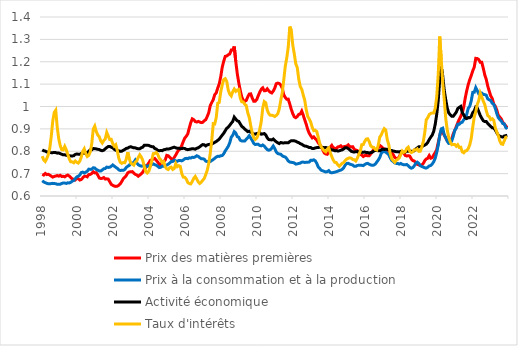
| Category | Prix des matières premières | Prix à la consommation et à la production | Activité économique | Taux d'intérêts |
|---|---|---|---|---|
| 1998-02-01 | 0.697 | 0.668 | 0.806 | 0.778 |
| 1998-03-01 | 0.694 | 0.663 | 0.802 | 0.761 |
| 1998-04-01 | 0.701 | 0.66 | 0.801 | 0.754 |
| 1998-05-01 | 0.696 | 0.657 | 0.797 | 0.767 |
| 1998-06-01 | 0.697 | 0.654 | 0.796 | 0.784 |
| 1998-07-01 | 0.693 | 0.655 | 0.794 | 0.813 |
| 1998-08-01 | 0.689 | 0.656 | 0.794 | 0.866 |
| 1998-09-01 | 0.684 | 0.657 | 0.794 | 0.935 |
| 1998-10-01 | 0.688 | 0.656 | 0.795 | 0.973 |
| 1998-11-01 | 0.689 | 0.655 | 0.794 | 0.983 |
| 1998-12-01 | 0.691 | 0.652 | 0.792 | 0.906 |
| 1999-01-01 | 0.689 | 0.653 | 0.792 | 0.856 |
| 1999-02-01 | 0.693 | 0.653 | 0.789 | 0.825 |
| 1999-03-01 | 0.687 | 0.656 | 0.787 | 0.807 |
| 1999-04-01 | 0.688 | 0.658 | 0.784 | 0.806 |
| 1999-05-01 | 0.686 | 0.658 | 0.784 | 0.822 |
| 1999-06-01 | 0.691 | 0.656 | 0.782 | 0.807 |
| 1999-07-01 | 0.694 | 0.659 | 0.781 | 0.786 |
| 1999-08-01 | 0.689 | 0.658 | 0.78 | 0.765 |
| 1999-09-01 | 0.682 | 0.661 | 0.779 | 0.753 |
| 1999-10-01 | 0.677 | 0.666 | 0.779 | 0.752 |
| 1999-11-01 | 0.675 | 0.669 | 0.78 | 0.749 |
| 1999-12-01 | 0.672 | 0.677 | 0.786 | 0.756 |
| 2000-01-01 | 0.68 | 0.685 | 0.788 | 0.751 |
| 2000-02-01 | 0.677 | 0.688 | 0.787 | 0.747 |
| 2000-03-01 | 0.671 | 0.694 | 0.786 | 0.755 |
| 2000-04-01 | 0.673 | 0.705 | 0.79 | 0.774 |
| 2000-05-01 | 0.681 | 0.707 | 0.79 | 0.8 |
| 2000-06-01 | 0.688 | 0.703 | 0.791 | 0.811 |
| 2000-07-01 | 0.689 | 0.707 | 0.791 | 0.789 |
| 2000-08-01 | 0.686 | 0.711 | 0.795 | 0.776 |
| 2000-09-01 | 0.696 | 0.72 | 0.799 | 0.782 |
| 2000-10-01 | 0.697 | 0.719 | 0.806 | 0.797 |
| 2000-11-01 | 0.701 | 0.719 | 0.807 | 0.834 |
| 2000-12-01 | 0.708 | 0.726 | 0.812 | 0.899 |
| 2001-01-01 | 0.703 | 0.726 | 0.812 | 0.913 |
| 2001-02-01 | 0.704 | 0.719 | 0.81 | 0.888 |
| 2001-03-01 | 0.694 | 0.715 | 0.809 | 0.872 |
| 2001-04-01 | 0.681 | 0.712 | 0.808 | 0.865 |
| 2001-05-01 | 0.678 | 0.712 | 0.804 | 0.846 |
| 2001-06-01 | 0.679 | 0.716 | 0.802 | 0.837 |
| 2001-07-01 | 0.682 | 0.722 | 0.805 | 0.848 |
| 2001-08-01 | 0.676 | 0.723 | 0.811 | 0.855 |
| 2001-09-01 | 0.677 | 0.729 | 0.817 | 0.884 |
| 2001-10-01 | 0.676 | 0.728 | 0.821 | 0.868 |
| 2001-11-01 | 0.664 | 0.729 | 0.821 | 0.852 |
| 2001-12-01 | 0.652 | 0.733 | 0.818 | 0.853 |
| 2002-01-01 | 0.648 | 0.739 | 0.815 | 0.834 |
| 2002-02-01 | 0.644 | 0.733 | 0.809 | 0.823 |
| 2002-03-01 | 0.643 | 0.728 | 0.805 | 0.829 |
| 2002-04-01 | 0.644 | 0.724 | 0.803 | 0.804 |
| 2002-05-01 | 0.648 | 0.717 | 0.802 | 0.769 |
| 2002-06-01 | 0.654 | 0.714 | 0.799 | 0.751 |
| 2002-07-01 | 0.665 | 0.715 | 0.8 | 0.746 |
| 2002-08-01 | 0.677 | 0.715 | 0.804 | 0.75 |
| 2002-09-01 | 0.684 | 0.719 | 0.808 | 0.749 |
| 2002-10-01 | 0.691 | 0.727 | 0.813 | 0.764 |
| 2002-11-01 | 0.703 | 0.733 | 0.814 | 0.796 |
| 2002-12-01 | 0.708 | 0.737 | 0.818 | 0.767 |
| 2003-01-01 | 0.708 | 0.747 | 0.82 | 0.746 |
| 2003-02-01 | 0.709 | 0.746 | 0.818 | 0.743 |
| 2003-03-01 | 0.703 | 0.75 | 0.815 | 0.738 |
| 2003-04-01 | 0.697 | 0.76 | 0.815 | 0.751 |
| 2003-05-01 | 0.694 | 0.748 | 0.813 | 0.757 |
| 2003-06-01 | 0.688 | 0.74 | 0.811 | 0.772 |
| 2003-07-01 | 0.694 | 0.736 | 0.811 | 0.784 |
| 2003-08-01 | 0.699 | 0.733 | 0.816 | 0.774 |
| 2003-09-01 | 0.706 | 0.734 | 0.818 | 0.76 |
| 2003-10-01 | 0.719 | 0.736 | 0.826 | 0.732 |
| 2003-11-01 | 0.727 | 0.735 | 0.827 | 0.709 |
| 2003-12-01 | 0.738 | 0.732 | 0.827 | 0.703 |
| 2004-01-01 | 0.747 | 0.735 | 0.826 | 0.71 |
| 2004-02-01 | 0.759 | 0.735 | 0.823 | 0.731 |
| 2004-03-01 | 0.761 | 0.741 | 0.821 | 0.757 |
| 2004-04-01 | 0.765 | 0.743 | 0.82 | 0.789 |
| 2004-05-01 | 0.768 | 0.74 | 0.812 | 0.79 |
| 2004-06-01 | 0.76 | 0.738 | 0.81 | 0.794 |
| 2004-07-01 | 0.752 | 0.733 | 0.804 | 0.786 |
| 2004-08-01 | 0.742 | 0.727 | 0.803 | 0.769 |
| 2004-09-01 | 0.74 | 0.728 | 0.803 | 0.762 |
| 2004-10-01 | 0.75 | 0.734 | 0.803 | 0.749 |
| 2004-11-01 | 0.755 | 0.733 | 0.807 | 0.753 |
| 2004-12-01 | 0.761 | 0.734 | 0.808 | 0.73 |
| 2005-01-01 | 0.782 | 0.739 | 0.81 | 0.722 |
| 2005-02-01 | 0.78 | 0.742 | 0.81 | 0.718 |
| 2005-03-01 | 0.773 | 0.748 | 0.811 | 0.727 |
| 2005-04-01 | 0.766 | 0.754 | 0.814 | 0.729 |
| 2005-05-01 | 0.763 | 0.755 | 0.816 | 0.719 |
| 2005-06-01 | 0.772 | 0.76 | 0.818 | 0.723 |
| 2005-07-01 | 0.783 | 0.757 | 0.815 | 0.744 |
| 2005-08-01 | 0.796 | 0.755 | 0.813 | 0.731 |
| 2005-09-01 | 0.806 | 0.759 | 0.814 | 0.735 |
| 2005-10-01 | 0.811 | 0.759 | 0.812 | 0.732 |
| 2005-11-01 | 0.825 | 0.757 | 0.812 | 0.7 |
| 2005-12-01 | 0.843 | 0.761 | 0.813 | 0.685 |
| 2006-01-01 | 0.859 | 0.767 | 0.812 | 0.683 |
| 2006-02-01 | 0.867 | 0.768 | 0.809 | 0.676 |
| 2006-03-01 | 0.877 | 0.767 | 0.807 | 0.66 |
| 2006-04-01 | 0.903 | 0.771 | 0.808 | 0.656 |
| 2006-05-01 | 0.927 | 0.77 | 0.81 | 0.654 |
| 2006-06-01 | 0.945 | 0.773 | 0.812 | 0.665 |
| 2006-07-01 | 0.941 | 0.772 | 0.811 | 0.679 |
| 2006-08-01 | 0.933 | 0.775 | 0.809 | 0.687 |
| 2006-09-01 | 0.931 | 0.78 | 0.813 | 0.676 |
| 2006-10-01 | 0.933 | 0.777 | 0.816 | 0.663 |
| 2006-11-01 | 0.931 | 0.771 | 0.82 | 0.656 |
| 2006-12-01 | 0.928 | 0.767 | 0.826 | 0.662 |
| 2007-01-01 | 0.929 | 0.767 | 0.83 | 0.67 |
| 2007-02-01 | 0.937 | 0.764 | 0.829 | 0.678 |
| 2007-03-01 | 0.941 | 0.756 | 0.824 | 0.696 |
| 2007-04-01 | 0.955 | 0.754 | 0.829 | 0.715 |
| 2007-05-01 | 0.973 | 0.754 | 0.83 | 0.747 |
| 2007-06-01 | 1.004 | 0.754 | 0.832 | 0.791 |
| 2007-07-01 | 1.018 | 0.759 | 0.832 | 0.848 |
| 2007-08-01 | 1.031 | 0.763 | 0.836 | 0.923 |
| 2007-09-01 | 1.053 | 0.769 | 0.84 | 0.922 |
| 2007-10-01 | 1.061 | 0.774 | 0.844 | 0.951 |
| 2007-11-01 | 1.083 | 0.777 | 0.849 | 1.015 |
| 2007-12-01 | 1.101 | 0.777 | 0.854 | 1.018 |
| 2008-01-01 | 1.133 | 0.78 | 0.863 | 1.065 |
| 2008-02-01 | 1.176 | 0.781 | 0.872 | 1.097 |
| 2008-03-01 | 1.203 | 0.789 | 0.88 | 1.12 |
| 2008-04-01 | 1.224 | 0.801 | 0.892 | 1.124 |
| 2008-05-01 | 1.226 | 0.812 | 0.902 | 1.112 |
| 2008-06-01 | 1.231 | 0.822 | 0.908 | 1.073 |
| 2008-07-01 | 1.235 | 0.838 | 0.916 | 1.055 |
| 2008-08-01 | 1.252 | 0.863 | 0.925 | 1.047 |
| 2008-09-01 | 1.252 | 0.871 | 0.933 | 1.066 |
| 2008-10-01 | 1.268 | 0.888 | 0.952 | 1.078 |
| 2008-11-01 | 1.202 | 0.882 | 0.944 | 1.068 |
| 2008-12-01 | 1.147 | 0.866 | 0.936 | 1.073 |
| 2009-01-01 | 1.106 | 0.862 | 0.934 | 1.076 |
| 2009-02-01 | 1.072 | 0.849 | 0.922 | 1.038 |
| 2009-03-01 | 1.043 | 0.846 | 0.911 | 1.021 |
| 2009-04-01 | 1.028 | 0.846 | 0.906 | 1.021 |
| 2009-05-01 | 1.023 | 0.846 | 0.899 | 1.01 |
| 2009-06-01 | 1.027 | 0.854 | 0.894 | 1.005 |
| 2009-07-01 | 1.043 | 0.86 | 0.888 | 0.972 |
| 2009-08-01 | 1.056 | 0.87 | 0.89 | 0.952 |
| 2009-09-01 | 1.057 | 0.859 | 0.887 | 0.914 |
| 2009-10-01 | 1.038 | 0.848 | 0.881 | 0.881 |
| 2009-11-01 | 1.023 | 0.835 | 0.877 | 0.861 |
| 2009-12-01 | 1.024 | 0.83 | 0.876 | 0.853 |
| 2010-01-01 | 1.031 | 0.831 | 0.879 | 0.859 |
| 2010-02-01 | 1.048 | 0.831 | 0.88 | 0.874 |
| 2010-03-01 | 1.064 | 0.826 | 0.883 | 0.897 |
| 2010-04-01 | 1.077 | 0.824 | 0.876 | 0.933 |
| 2010-05-01 | 1.083 | 0.828 | 0.877 | 0.992 |
| 2010-06-01 | 1.07 | 0.823 | 0.879 | 1.022 |
| 2010-07-01 | 1.071 | 0.815 | 0.873 | 1.017 |
| 2010-08-01 | 1.079 | 0.807 | 0.86 | 0.984 |
| 2010-09-01 | 1.07 | 0.804 | 0.852 | 0.968 |
| 2010-10-01 | 1.064 | 0.807 | 0.851 | 0.961 |
| 2010-11-01 | 1.06 | 0.814 | 0.851 | 0.961 |
| 2010-12-01 | 1.069 | 0.823 | 0.855 | 0.959 |
| 2011-01-01 | 1.082 | 0.812 | 0.848 | 0.955 |
| 2011-02-01 | 1.102 | 0.797 | 0.842 | 0.96 |
| 2011-03-01 | 1.105 | 0.79 | 0.838 | 0.967 |
| 2011-04-01 | 1.103 | 0.788 | 0.834 | 0.989 |
| 2011-05-01 | 1.096 | 0.787 | 0.839 | 1.027 |
| 2011-06-01 | 1.082 | 0.779 | 0.837 | 1.061 |
| 2011-07-01 | 1.053 | 0.776 | 0.837 | 1.118 |
| 2011-08-01 | 1.041 | 0.774 | 0.838 | 1.179 |
| 2011-09-01 | 1.033 | 0.767 | 0.838 | 1.217 |
| 2011-10-01 | 1.033 | 0.756 | 0.838 | 1.266 |
| 2011-11-01 | 1.011 | 0.752 | 0.843 | 1.357 |
| 2011-12-01 | 0.988 | 0.75 | 0.847 | 1.342 |
| 2012-01-01 | 0.968 | 0.75 | 0.847 | 1.275 |
| 2012-02-01 | 0.954 | 0.748 | 0.847 | 1.236 |
| 2012-03-01 | 0.95 | 0.743 | 0.845 | 1.191 |
| 2012-04-01 | 0.955 | 0.744 | 0.841 | 1.174 |
| 2012-05-01 | 0.965 | 0.745 | 0.839 | 1.122 |
| 2012-06-01 | 0.966 | 0.747 | 0.834 | 1.089 |
| 2012-07-01 | 0.979 | 0.751 | 0.832 | 1.077 |
| 2012-08-01 | 0.961 | 0.751 | 0.826 | 1.051 |
| 2012-09-01 | 0.94 | 0.75 | 0.823 | 1.027 |
| 2012-10-01 | 0.92 | 0.751 | 0.823 | 0.985 |
| 2012-11-01 | 0.897 | 0.751 | 0.82 | 0.955 |
| 2012-12-01 | 0.88 | 0.752 | 0.817 | 0.944 |
| 2013-01-01 | 0.869 | 0.76 | 0.817 | 0.93 |
| 2013-02-01 | 0.86 | 0.759 | 0.812 | 0.906 |
| 2013-03-01 | 0.864 | 0.762 | 0.812 | 0.892 |
| 2013-04-01 | 0.856 | 0.757 | 0.815 | 0.894 |
| 2013-05-01 | 0.85 | 0.746 | 0.816 | 0.888 |
| 2013-06-01 | 0.837 | 0.73 | 0.817 | 0.863 |
| 2013-07-01 | 0.83 | 0.723 | 0.818 | 0.835 |
| 2013-08-01 | 0.819 | 0.715 | 0.818 | 0.819 |
| 2013-09-01 | 0.806 | 0.713 | 0.817 | 0.81 |
| 2013-10-01 | 0.792 | 0.71 | 0.816 | 0.802 |
| 2013-11-01 | 0.788 | 0.707 | 0.817 | 0.797 |
| 2013-12-01 | 0.786 | 0.709 | 0.814 | 0.809 |
| 2014-01-01 | 0.798 | 0.713 | 0.814 | 0.815 |
| 2014-02-01 | 0.818 | 0.705 | 0.809 | 0.794 |
| 2014-03-01 | 0.826 | 0.704 | 0.806 | 0.776 |
| 2014-04-01 | 0.815 | 0.705 | 0.805 | 0.761 |
| 2014-05-01 | 0.814 | 0.707 | 0.802 | 0.751 |
| 2014-06-01 | 0.811 | 0.708 | 0.803 | 0.75 |
| 2014-07-01 | 0.819 | 0.711 | 0.801 | 0.739 |
| 2014-08-01 | 0.82 | 0.714 | 0.802 | 0.733 |
| 2014-09-01 | 0.824 | 0.716 | 0.805 | 0.74 |
| 2014-10-01 | 0.817 | 0.719 | 0.806 | 0.747 |
| 2014-11-01 | 0.821 | 0.727 | 0.811 | 0.75 |
| 2014-12-01 | 0.822 | 0.739 | 0.816 | 0.759 |
| 2015-01-01 | 0.823 | 0.745 | 0.815 | 0.765 |
| 2015-02-01 | 0.828 | 0.746 | 0.812 | 0.769 |
| 2015-03-01 | 0.821 | 0.742 | 0.806 | 0.77 |
| 2015-04-01 | 0.819 | 0.74 | 0.8 | 0.769 |
| 2015-05-01 | 0.82 | 0.738 | 0.797 | 0.763 |
| 2015-06-01 | 0.808 | 0.733 | 0.797 | 0.762 |
| 2015-07-01 | 0.805 | 0.733 | 0.798 | 0.756 |
| 2015-08-01 | 0.803 | 0.736 | 0.799 | 0.768 |
| 2015-09-01 | 0.793 | 0.737 | 0.796 | 0.785 |
| 2015-10-01 | 0.786 | 0.737 | 0.795 | 0.799 |
| 2015-11-01 | 0.783 | 0.737 | 0.796 | 0.829 |
| 2015-12-01 | 0.776 | 0.736 | 0.795 | 0.83 |
| 2016-01-01 | 0.781 | 0.741 | 0.796 | 0.844 |
| 2016-02-01 | 0.782 | 0.745 | 0.794 | 0.854 |
| 2016-03-01 | 0.779 | 0.746 | 0.794 | 0.856 |
| 2016-04-01 | 0.78 | 0.742 | 0.792 | 0.843 |
| 2016-05-01 | 0.788 | 0.739 | 0.794 | 0.824 |
| 2016-06-01 | 0.798 | 0.737 | 0.796 | 0.818 |
| 2016-07-01 | 0.808 | 0.738 | 0.801 | 0.817 |
| 2016-08-01 | 0.804 | 0.742 | 0.804 | 0.808 |
| 2016-09-01 | 0.805 | 0.751 | 0.803 | 0.805 |
| 2016-10-01 | 0.815 | 0.761 | 0.803 | 0.827 |
| 2016-11-01 | 0.826 | 0.772 | 0.802 | 0.863 |
| 2016-12-01 | 0.821 | 0.79 | 0.807 | 0.873 |
| 2017-01-01 | 0.814 | 0.799 | 0.81 | 0.889 |
| 2017-02-01 | 0.811 | 0.797 | 0.808 | 0.901 |
| 2017-03-01 | 0.805 | 0.797 | 0.81 | 0.895 |
| 2017-04-01 | 0.801 | 0.79 | 0.809 | 0.852 |
| 2017-05-01 | 0.799 | 0.785 | 0.807 | 0.83 |
| 2017-06-01 | 0.796 | 0.77 | 0.802 | 0.789 |
| 2017-07-01 | 0.792 | 0.759 | 0.803 | 0.766 |
| 2017-08-01 | 0.785 | 0.754 | 0.801 | 0.758 |
| 2017-09-01 | 0.772 | 0.748 | 0.799 | 0.751 |
| 2017-10-01 | 0.768 | 0.746 | 0.798 | 0.759 |
| 2017-11-01 | 0.767 | 0.746 | 0.798 | 0.765 |
| 2017-12-01 | 0.776 | 0.742 | 0.797 | 0.77 |
| 2018-01-01 | 0.789 | 0.745 | 0.8 | 0.786 |
| 2018-02-01 | 0.795 | 0.742 | 0.797 | 0.801 |
| 2018-03-01 | 0.793 | 0.739 | 0.795 | 0.795 |
| 2018-04-01 | 0.781 | 0.739 | 0.796 | 0.798 |
| 2018-05-01 | 0.779 | 0.741 | 0.799 | 0.813 |
| 2018-06-01 | 0.78 | 0.735 | 0.8 | 0.818 |
| 2018-07-01 | 0.778 | 0.728 | 0.801 | 0.8 |
| 2018-08-01 | 0.766 | 0.724 | 0.8 | 0.794 |
| 2018-09-01 | 0.758 | 0.727 | 0.799 | 0.797 |
| 2018-10-01 | 0.757 | 0.735 | 0.803 | 0.807 |
| 2018-11-01 | 0.749 | 0.746 | 0.81 | 0.805 |
| 2018-12-01 | 0.741 | 0.751 | 0.815 | 0.81 |
| 2019-01-01 | 0.739 | 0.746 | 0.82 | 0.8 |
| 2019-02-01 | 0.736 | 0.736 | 0.82 | 0.8 |
| 2019-03-01 | 0.738 | 0.732 | 0.82 | 0.818 |
| 2019-04-01 | 0.745 | 0.73 | 0.824 | 0.842 |
| 2019-05-01 | 0.758 | 0.726 | 0.827 | 0.883 |
| 2019-06-01 | 0.766 | 0.725 | 0.832 | 0.941 |
| 2019-07-01 | 0.768 | 0.729 | 0.839 | 0.95 |
| 2019-08-01 | 0.781 | 0.734 | 0.853 | 0.964 |
| 2019-09-01 | 0.769 | 0.736 | 0.863 | 0.969 |
| 2019-10-01 | 0.771 | 0.743 | 0.872 | 0.971 |
| 2019-11-01 | 0.784 | 0.753 | 0.889 | 0.971 |
| 2019-12-01 | 0.794 | 0.769 | 0.921 | 0.991 |
| 2020-01-01 | 0.808 | 0.795 | 0.966 | 1.045 |
| 2020-02-01 | 0.839 | 0.827 | 1.028 | 1.145 |
| 2020-03-01 | 0.87 | 0.872 | 1.121 | 1.313 |
| 2020-04-01 | 0.892 | 0.9 | 1.178 | 1.21 |
| 2020-05-01 | 0.884 | 0.903 | 1.135 | 1.106 |
| 2020-06-01 | 0.872 | 0.873 | 1.072 | 1.031 |
| 2020-07-01 | 0.859 | 0.861 | 1.03 | 0.946 |
| 2020-08-01 | 0.846 | 0.845 | 0.993 | 0.895 |
| 2020-09-01 | 0.842 | 0.835 | 0.971 | 0.862 |
| 2020-10-01 | 0.848 | 0.836 | 0.963 | 0.841 |
| 2020-11-01 | 0.856 | 0.846 | 0.956 | 0.829 |
| 2020-12-01 | 0.878 | 0.866 | 0.957 | 0.83 |
| 2021-01-01 | 0.892 | 0.894 | 0.965 | 0.83 |
| 2021-02-01 | 0.91 | 0.903 | 0.974 | 0.822 |
| 2021-03-01 | 0.927 | 0.921 | 0.991 | 0.829 |
| 2021-04-01 | 0.943 | 0.92 | 0.996 | 0.817 |
| 2021-05-01 | 0.956 | 0.927 | 1 | 0.818 |
| 2021-06-01 | 0.971 | 0.93 | 0.973 | 0.797 |
| 2021-07-01 | 0.998 | 0.941 | 0.963 | 0.793 |
| 2021-08-01 | 1.038 | 0.948 | 0.95 | 0.801 |
| 2021-09-01 | 1.071 | 0.966 | 0.946 | 0.803 |
| 2021-10-01 | 1.098 | 0.992 | 0.95 | 0.812 |
| 2021-11-01 | 1.12 | 1.001 | 0.95 | 0.829 |
| 2021-12-01 | 1.138 | 1.025 | 0.955 | 0.857 |
| 2022-01-01 | 1.16 | 1.063 | 0.973 | 0.908 |
| 2022-02-01 | 1.176 | 1.064 | 0.98 | 0.954 |
| 2022-03-01 | 1.215 | 1.085 | 0.998 | 0.976 |
| 2022-04-01 | 1.214 | 1.071 | 0.994 | 1.009 |
| 2022-05-01 | 1.21 | 1.056 | 0.977 | 1.026 |
| 2022-06-01 | 1.197 | 1.055 | 0.96 | 1.06 |
| 2022-07-01 | 1.197 | 1.06 | 0.948 | 1.043 |
| 2022-08-01 | 1.171 | 1.054 | 0.936 | 1.024 |
| 2022-09-01 | 1.142 | 1.053 | 0.933 | 1.009 |
| 2022-10-01 | 1.121 | 1.051 | 0.933 | 0.982 |
| 2022-11-01 | 1.091 | 1.034 | 0.924 | 0.959 |
| 2022-12-01 | 1.069 | 1.03 | 0.918 | 0.954 |
| 2023-01-01 | 1.047 | 1.027 | 0.911 | 0.942 |
| 2023-02-01 | 1.036 | 1.014 | 0.905 | 0.945 |
| 2023-03-01 | 1.011 | 1.01 | 0.904 | 0.939 |
| 2023-04-01 | 1.002 | 0.992 | 0.896 | 0.906 |
| 2023-05-01 | 0.985 | 0.969 | 0.883 | 0.887 |
| 2023-06-01 | 0.961 | 0.951 | 0.872 | 0.871 |
| 2023-07-01 | 0.953 | 0.942 | 0.868 | 0.846 |
| 2023-08-01 | 0.945 | 0.935 | 0.865 | 0.833 |
| 2023-09-01 | 0.93 | 0.924 | 0.863 | 0.831 |
| 2023-10-01 | 0.922 | 0.922 | 0.868 | 0.846 |
| 2023-11-01 | 0.914 | 0.907 | 0.87 | 0.862 |
| 2023-12-01 | 0.905 | 0.899 | 0.872 | 0.864 |